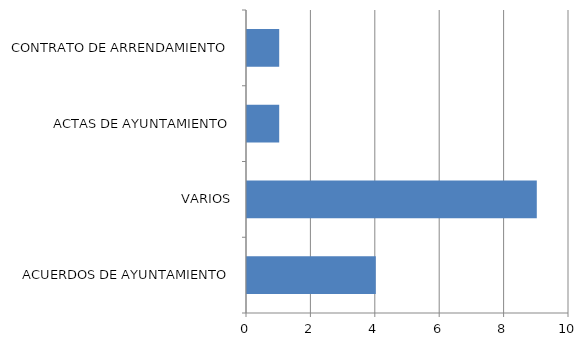
| Category | Series 0 |
|---|---|
| ACUERDOS DE AYUNTAMIENTO | 4 |
| VARIOS | 9 |
| ACTAS DE AYUNTAMIENTO | 1 |
| CONTRATO DE ARRENDAMIENTO | 1 |